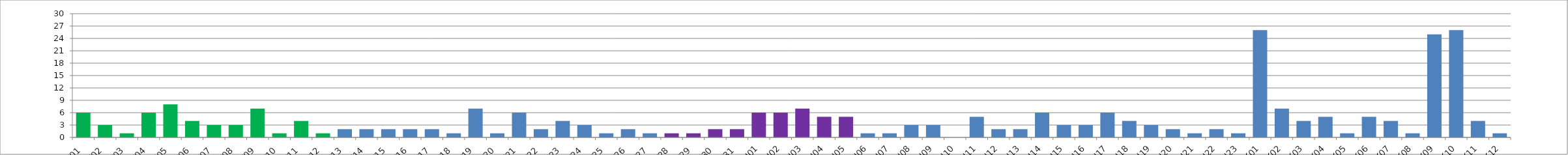
| Category | Series 0 |
|---|---|
| W01 | 6 |
| W02 | 3 |
| W03 | 1 |
| W04 | 6 |
| W05 | 8 |
| W06 | 4 |
| W07 | 3 |
| W08 | 3 |
| W09 | 7 |
| W10 | 1 |
| W11 | 4 |
| W12 | 1 |
| W13 | 2 |
| W14 | 2 |
| W15 | 2 |
| W16 | 2 |
| W17 | 2 |
| W18 | 1 |
| W19 | 7 |
| W20 | 1 |
| W21 | 6 |
| W22 | 2 |
| W23 | 4 |
| W24 | 3 |
| W25 | 1 |
| W26 | 2 |
| W27 | 1 |
| W28 | 1 |
| W29 | 1 |
| W30 | 2 |
| W31 | 2 |
| U01 | 6 |
| U02 | 6 |
| U03 | 7 |
| U04 | 5 |
| U05 | 5 |
| U06 | 1 |
| U07 | 1 |
| U08 | 3 |
| U09 | 3 |
| U10 | 0 |
| U11 | 5 |
| U12 | 2 |
| U13 | 2 |
| U14 | 6 |
| U15 | 3 |
| U16 | 3 |
| U17 | 6 |
| U18 | 4 |
| U19 | 3 |
| U20 | 2 |
| U21 | 1 |
| U22 | 2 |
| U23 | 1 |
| K01 | 26 |
| K02 | 7 |
| K03 | 4 |
| K04 | 5 |
| K05 | 1 |
| K06 | 5 |
| K07 | 4 |
| K08 | 1 |
| K09 | 25 |
| K10 | 26 |
| K11 | 4 |
| K12 | 1 |